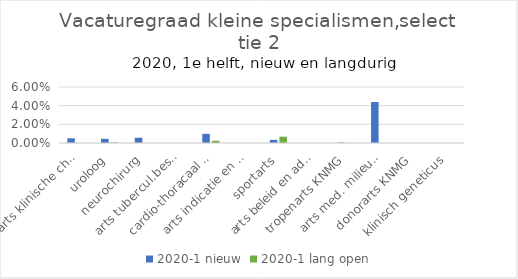
| Category | 2020-1 |
|---|---|
| arts klinische chemie | 0 |
| uroloog | 0.001 |
| neurochirurg | 0 |
| arts tubercul.bestr. KNMG | 0 |
| cardio-thoracaal chirurg | 0.002 |
| arts indicatie en advies KNMG | 0 |
| sportarts | 0.007 |
| arts beleid en advies KNMG | 0 |
| tropenarts KNMG | 0 |
| arts med. milieuk. KNMG | 0 |
| donorarts KNMG | 0 |
| klinisch geneticus | 0 |